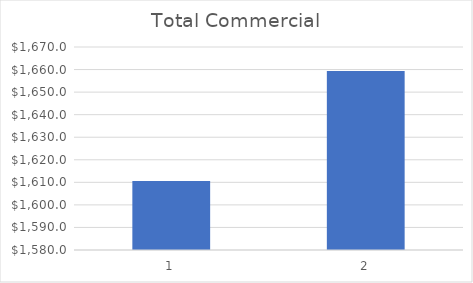
| Category | Total Commercial |
|---|---|
| 0 | 1610.557 |
| 1 | 1659.391 |